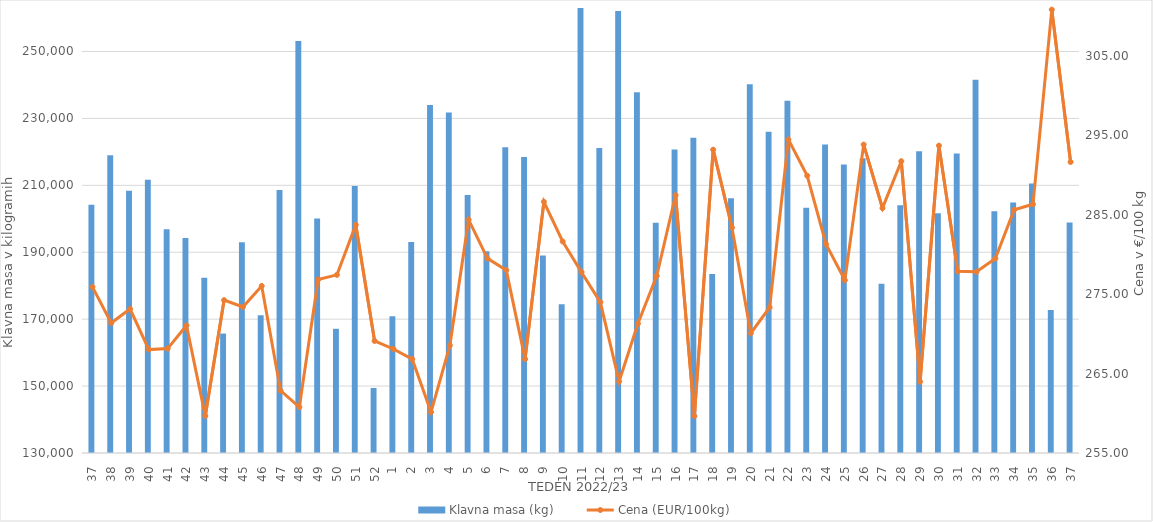
| Category | Klavna masa (kg) |
|---|---|
| 37.0 | 204224 |
| 38.0 | 218966 |
| 39.0 | 208403 |
| 40.0 | 211635 |
| 41.0 | 196841 |
| 42.0 | 194271 |
| 43.0 | 182399 |
| 44.0 | 165696 |
| 45.0 | 193022 |
| 46.0 | 171172 |
| 47.0 | 208597 |
| 48.0 | 253151 |
| 49.0 | 200117 |
| 50.0 | 167119 |
| 51.0 | 209797 |
| 52.0 | 149439 |
| 1.0 | 170843 |
| 2.0 | 193093 |
| 3.0 | 234042 |
| 4.0 | 231737 |
| 5.0 | 207136 |
| 6.0 | 190311 |
| 7.0 | 221366 |
| 8.0 | 218470 |
| 9.0 | 189006 |
| 10.0 | 174425 |
| 11.0 | 265476 |
| 12.0 | 221171 |
| 13.0 | 262102 |
| 14.0 | 237813 |
| 15.0 | 198828 |
| 16.0 | 220686 |
| 17.0 | 224192 |
| 18.0 | 183508 |
| 19.0 | 206133 |
| 20.0 | 240223 |
| 21.0 | 226050 |
| 22.0 | 235273 |
| 23.0 | 203306 |
| 24.0 | 222178 |
| 25.0 | 216259 |
| 26.0 | 218064 |
| 27.0 | 180556 |
| 28.0 | 204078 |
| 29.0 | 220162 |
| 30.0 | 201649 |
| 31.0 | 219538 |
| 32.0 | 241549 |
| 33.0 | 202261 |
| 34.0 | 204903 |
| 35.0 | 210575 |
| 36.0 | 172745 |
| 37.0 | 198877 |